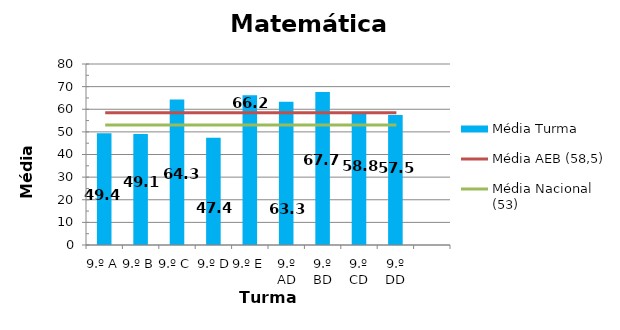
| Category | Média Turma |
|---|---|
| 9.º A | 49.35 |
| 9.º B | 49.11 |
| 9.º C | 64.33 |
| 9.º D | 47.44 |
| 9.º E | 66.22 |
| 9.º AD | 63.32 |
| 9.º BD | 67.65 |
| 9.º CD | 58.76 |
| 9.º DD | 57.46 |